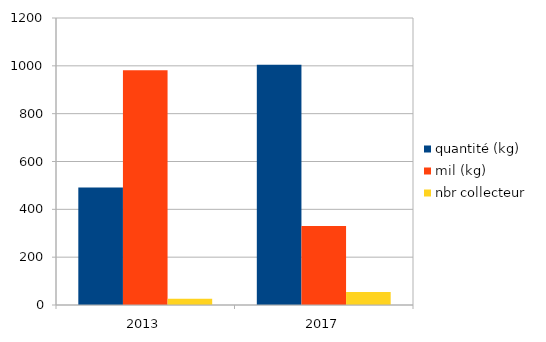
| Category | quantité (kg) | mil (kg) | nbr collecteur |
|---|---|---|---|
| 2013 | 491 | 982 | 26 |
| 2017 | 1005 | 330 | 54 |